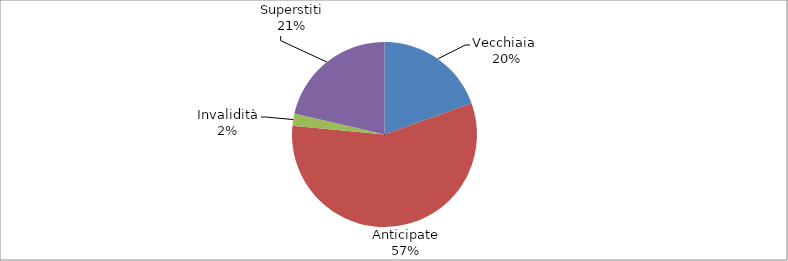
| Category | Series 0 |
|---|---|
| Vecchiaia  | 26195 |
| Anticipate | 76489 |
| Invalidità | 2828 |
| Superstiti | 28671 |